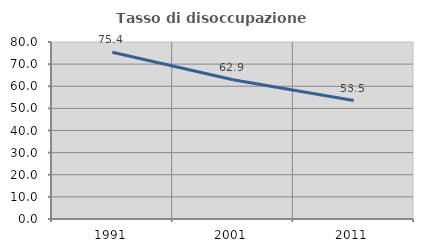
| Category | Tasso di disoccupazione giovanile  |
|---|---|
| 1991.0 | 75.397 |
| 2001.0 | 62.931 |
| 2011.0 | 53.543 |